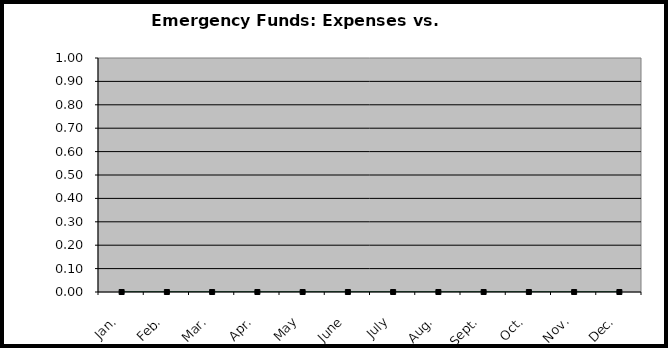
| Category | Series 0 | Series 1 |
|---|---|---|
| Jan. | 0 | 0 |
| Feb. | 0 | 0 |
| Mar. | 0 | 0 |
| Apr. | 0 | 0 |
| May | 0 | 0 |
| June | 0 | 0 |
| July | 0 | 0 |
| Aug. | 0 | 0 |
| Sept. | 0 | 0 |
| Oct. | 0 | 0 |
| Nov. | 0 | 0 |
| Dec. | 0 | 0 |